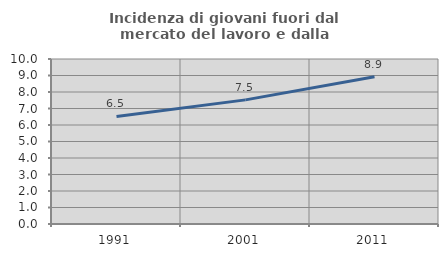
| Category | Incidenza di giovani fuori dal mercato del lavoro e dalla formazione  |
|---|---|
| 1991.0 | 6.517 |
| 2001.0 | 7.522 |
| 2011.0 | 8.925 |